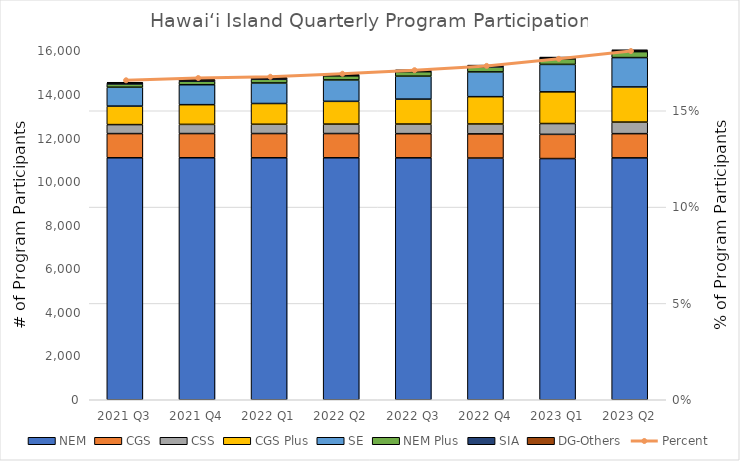
| Category | NEM | CGS | CSS | CGS Plus | SE | NEM Plus | SIA | DG-Others |
|---|---|---|---|---|---|---|---|---|
| 2021 Q3 | 11105 | 1110 | 412 | 849 | 867 | 151 | 54 | 21 |
| 2021 Q4 | 11105 | 1111 | 421 | 905 | 916 | 161 | 55 | 21 |
| 2022 Q1 | 11105 | 1112 | 426 | 952 | 943 | 174 | 55 | 21 |
| 2022 Q2 | 11105 | 1112 | 433 | 1045 | 982 | 188 | 56 | 21 |
| 2022 Q3 | 11103 | 1109 | 440 | 1145 | 1053 | 205 | 57 | 21 |
| 2022 Q4 | 11093 | 1109 | 453 | 1254 | 1137 | 230 | 57 | 21 |
| 2023 Q1 | 11069 | 1111 | 496 | 1454 | 1260 | 254 | 57 | 21 |
| 2023 Q2 | 11101 | 1111 | 531 | 1613 | 1347 | 272 | 57 | 21 |